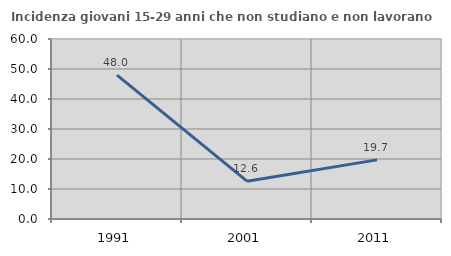
| Category | Incidenza giovani 15-29 anni che non studiano e non lavorano  |
|---|---|
| 1991.0 | 47.97 |
| 2001.0 | 12.602 |
| 2011.0 | 19.712 |